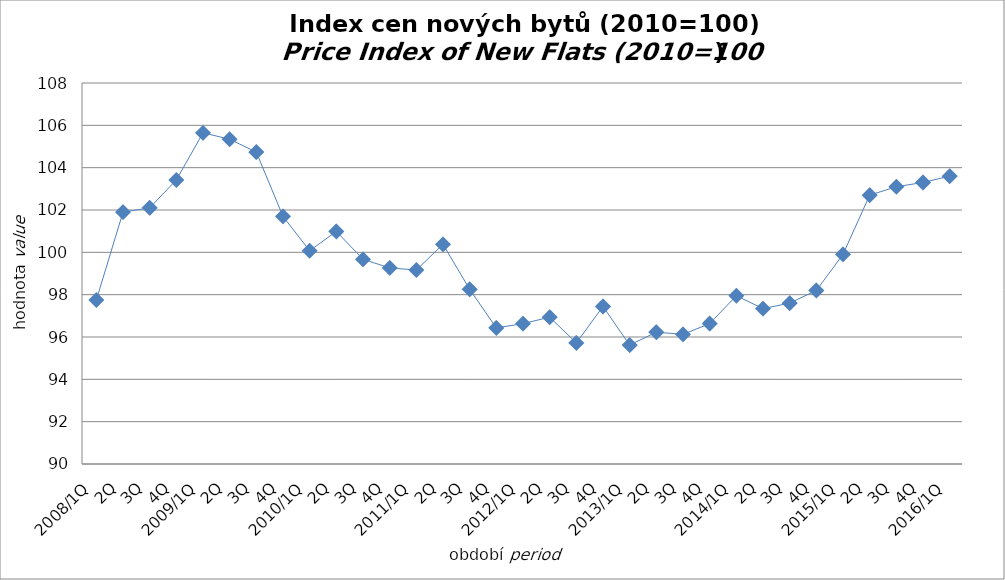
| Category | Series 0 |
|---|---|
| 2008/1Q | 97.746 |
| 2Q | 101.899 |
| 3Q | 102.102 |
| 4Q | 103.419 |
| 2009/1Q | 105.647 |
| 2Q | 105.343 |
| 3Q | 104.735 |
| 4Q | 101.697 |
| 2010/1Q | 100.076 |
| 2Q | 100.988 |
| 3Q | 99.671 |
| 4Q | 99.266 |
| 2011/1Q | 99.164 |
| 2Q | 100.38 |
| 3Q | 98.253 |
| 4Q | 96.429 |
| 2012/1Q | 96.632 |
| 2Q | 96.936 |
| 3Q | 95.72 |
| 4Q | 97.442 |
| 2013/1Q | 95.619 |
| 2Q | 96.227 |
| 3Q | 96.126 |
| 4Q | 96.632 |
| 2014/1Q | 97.949 |
| 2Q | 97.341 |
| 3Q | 97.6 |
| 4Q | 98.2 |
| 2015/1Q | 99.9 |
| 2Q | 102.7 |
| 3Q | 103.1 |
| 4Q | 103.3 |
| 2016/1Q | 103.6 |